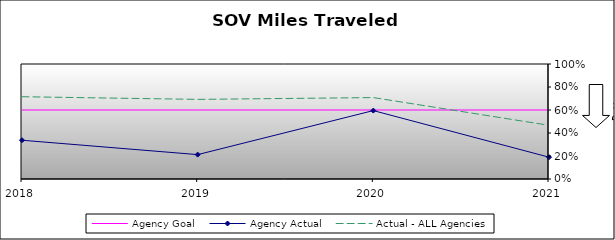
| Category | Agency Goal | Agency Actual | Actual - ALL Agencies |
|---|---|---|---|
| 2018.0 | 0.6 | 0.337 | 0.715 |
| 2019.0 | 0.6 | 0.212 | 0.692 |
| 2020.0 | 0.6 | 0.595 | 0.708 |
| 2021.0 | 0.6 | 0.19 | 0.467 |